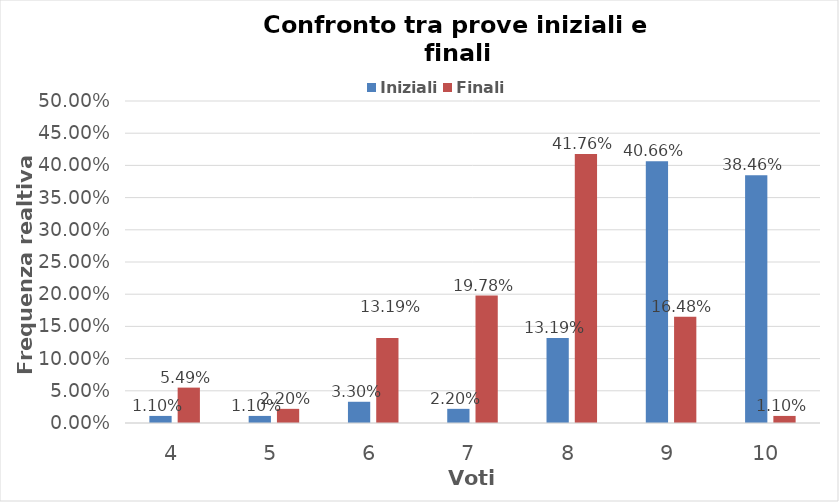
| Category | Iniziali | Finali |
|---|---|---|
| 4.0 | 0.011 | 0.055 |
| 5.0 | 0.011 | 0.022 |
| 6.0 | 0.033 | 0.132 |
| 7.0 | 0.022 | 0.198 |
| 8.0 | 0.132 | 0.418 |
| 9.0 | 0.407 | 0.165 |
| 10.0 | 0.385 | 0.011 |